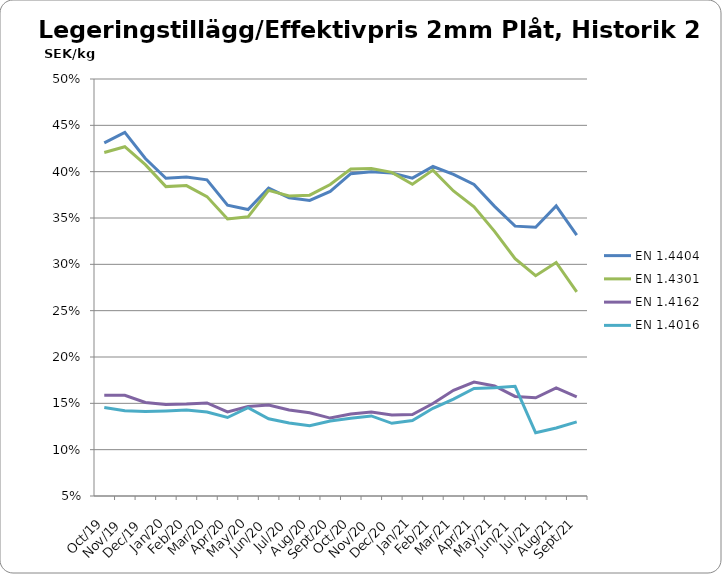
| Category | EN 1.4404 | EN 1.4301 | EN 1.4162  | EN 1.4016 |
|---|---|---|---|---|
| 2019-10-01 | 0.431 | 0.421 | 0.159 | 0.145 |
| 2019-11-01 | 0.442 | 0.427 | 0.159 | 0.142 |
| 2019-12-01 | 0.414 | 0.408 | 0.151 | 0.141 |
| 2020-01-01 | 0.393 | 0.384 | 0.149 | 0.142 |
| 2020-02-01 | 0.394 | 0.385 | 0.149 | 0.143 |
| 2020-03-01 | 0.391 | 0.373 | 0.15 | 0.141 |
| 2020-04-01 | 0.364 | 0.349 | 0.141 | 0.135 |
| 2020-05-01 | 0.359 | 0.351 | 0.146 | 0.145 |
| 2020-06-01 | 0.382 | 0.38 | 0.148 | 0.133 |
| 2020-07-01 | 0.372 | 0.374 | 0.143 | 0.129 |
| 2020-08-01 | 0.369 | 0.375 | 0.14 | 0.126 |
| 2020-09-01 | 0.379 | 0.386 | 0.134 | 0.131 |
| 2020-10-01 | 0.398 | 0.403 | 0.138 | 0.134 |
| 2020-11-01 | 0.4 | 0.403 | 0.141 | 0.136 |
| 2020-12-01 | 0.399 | 0.399 | 0.137 | 0.128 |
| 2021-01-01 | 0.393 | 0.386 | 0.138 | 0.131 |
| 2021-02-01 | 0.406 | 0.402 | 0.15 | 0.145 |
| 2021-03-01 | 0.397 | 0.379 | 0.164 | 0.155 |
| 2021-04-01 | 0.386 | 0.362 | 0.173 | 0.166 |
| 2021-05-01 | 0.363 | 0.336 | 0.169 | 0.167 |
| 2021-06-01 | 0.341 | 0.306 | 0.157 | 0.168 |
| 2021-07-01 | 0.34 | 0.288 | 0.156 | 0.118 |
| 2021-08-01 | 0.363 | 0.302 | 0.167 | 0.123 |
| 2021-09-01 | 0.332 | 0.27 | 0.157 | 0.13 |